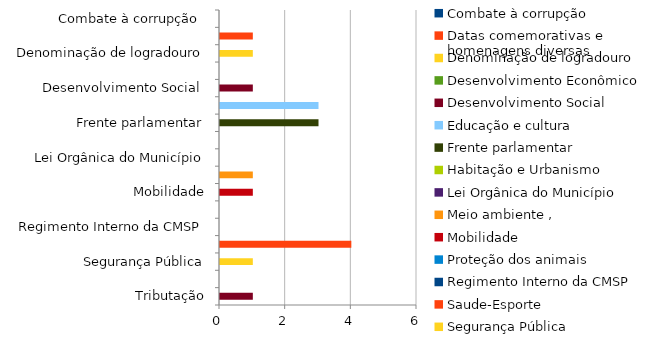
| Category | Projeto |
|---|---|
| Combate à corrupção  | 0 |
| Datas comemorativas e homenagens diversas | 1 |
| Denominação de logradouro | 1 |
| Desenvolvimento Econômico | 0 |
| Desenvolvimento Social  | 1 |
| Educação e cultura | 3 |
| Frente parlamentar | 3 |
| Habitação e Urbanismo | 0 |
| Lei Orgânica do Município | 0 |
| Meio ambiente ,  | 1 |
| Mobilidade | 1 |
| Proteção dos animais | 0 |
| Regimento Interno da CMSP | 0 |
| Saude-Esporte | 4 |
| Segurança Pública | 1 |
| Transparencia | 0 |
| Tributação | 1 |